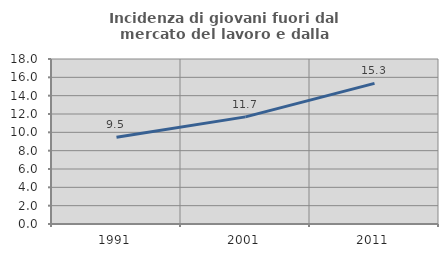
| Category | Incidenza di giovani fuori dal mercato del lavoro e dalla formazione  |
|---|---|
| 1991.0 | 9.474 |
| 2001.0 | 11.688 |
| 2011.0 | 15.337 |